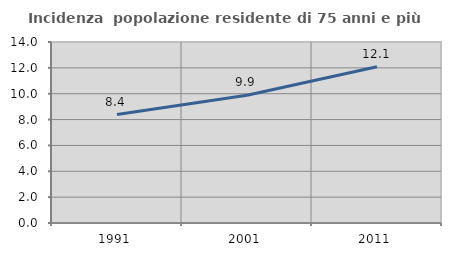
| Category | Incidenza  popolazione residente di 75 anni e più |
|---|---|
| 1991.0 | 8.384 |
| 2001.0 | 9.876 |
| 2011.0 | 12.09 |